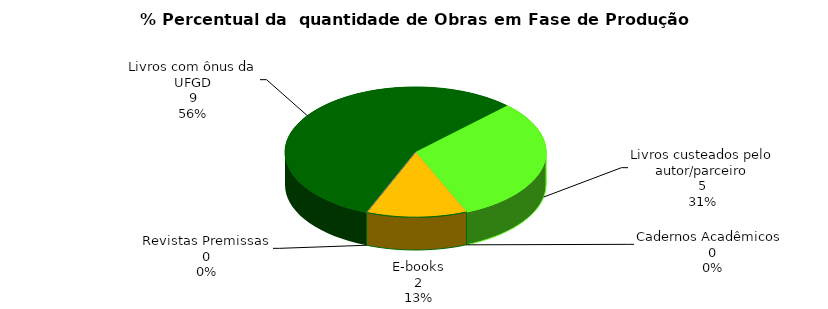
| Category | Series 0 |
|---|---|
| Livros com ônus da UFGD | 9 |
| Livros custeados pelo autor/parceiro | 5 |
| Cadernos Acadêmicos  | 0 |
| E-books | 2 |
| Revistas Premissas | 0 |